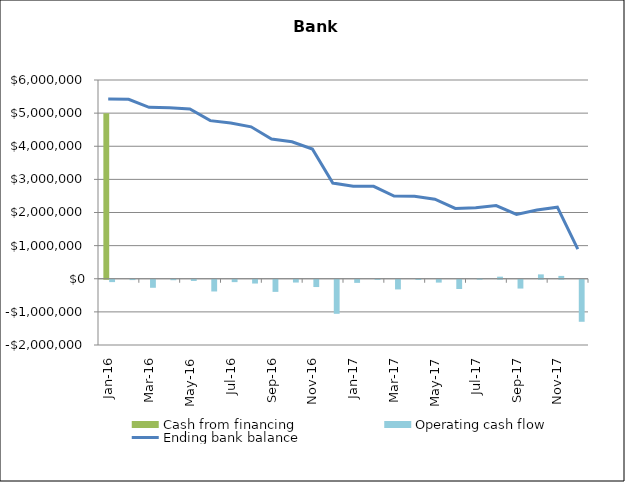
| Category | Cash from financing | Operating cash flow |
|---|---|---|
| 2016-01-01 | 5000000 | -71069.25 |
| 2016-02-01 | 0 | -10097.396 |
| 2016-03-01 | 0 | -242224.066 |
| 2016-04-01 | 0 | -13824.971 |
| 2016-05-01 | 0 | -36135.174 |
| 2016-06-01 | 0 | -353845.25 |
| 2016-07-01 | 0 | -71940.376 |
| 2016-08-01 | 0 | -114369.993 |
| 2016-09-01 | 0 | -366219.941 |
| 2016-10-01 | 0 | -84525.901 |
| 2016-11-01 | 0 | -220077.001 |
| 2016-12-01 | 0 | -1028046.392 |
| 2017-01-01 | 0 | -94347.579 |
| 2017-02-01 | 0 | -4496.229 |
| 2017-03-01 | 0 | -292072.322 |
| 2017-04-01 | 0 | -8158.843 |
| 2017-05-01 | 0 | -86114.505 |
| 2017-06-01 | 0 | -278941.437 |
| 2017-07-01 | 0 | 22804.569 |
| 2017-08-01 | 0 | 62790.75 |
| 2017-09-01 | 0 | -265903.793 |
| 2017-10-01 | 0 | 132062.112 |
| 2017-11-01 | 0 | 85538.184 |
| 2017-12-01 | 0 | -1268639.258 |